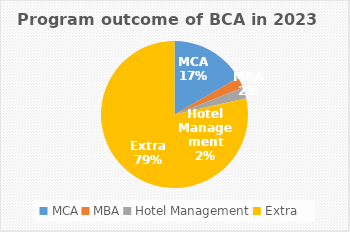
| Category | Series 0 |
|---|---|
| MCA | 7 |
| MBA | 1 |
| Hotel Management | 1 |
| Extra | 33 |